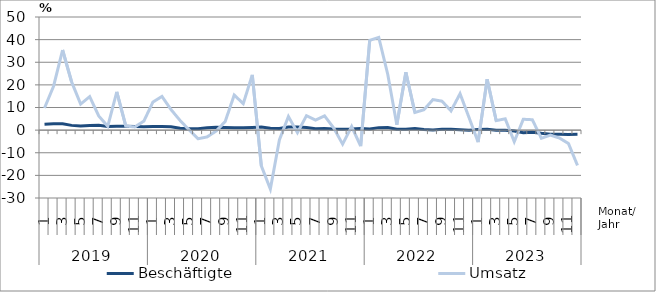
| Category | Beschäftigte | Umsatz |
|---|---|---|
| 0 | 2.6 | 9.8 |
| 1 | 2.8 | 19.4 |
| 2 | 2.8 | 35.4 |
| 3 | 2.1 | 21.3 |
| 4 | 1.8 | 11.5 |
| 5 | 2 | 14.8 |
| 6 | 2.1 | 6.3 |
| 7 | 1.6 | 1.7 |
| 8 | 1.7 | 16.9 |
| 9 | 1.7 | 1.8 |
| 10 | 1.6 | 1.4 |
| 11 | 1.5 | 4 |
| 12 | 1.6 | 12.4 |
| 13 | 1.6 | 14.9 |
| 14 | 1.5 | 9.1 |
| 15 | 0.8 | 4.3 |
| 16 | 0.6 | 0.1 |
| 17 | 0.6 | -3.8 |
| 18 | 1 | -3 |
| 19 | 1.3 | -0.4 |
| 20 | 1.2 | 3.8 |
| 21 | 1 | 15.5 |
| 22 | 1 | 11.7 |
| 23 | 1.2 | 24.4 |
| 24 | 1.4 | -15.8 |
| 25 | 0.8 | -26 |
| 26 | 0.7 | -4.3 |
| 27 | 1.4 | 6 |
| 28 | 1.4 | -1.1 |
| 29 | 1.2 | 6.4 |
| 30 | 0.6 | 4.4 |
| 31 | 0.7 | 6.3 |
| 32 | 0.5 | 1 |
| 33 | 0.4 | -6.2 |
| 34 | 0.5 | 1.6 |
| 35 | 0.7 | -7.1 |
| 36 | 0.5 | 39.7 |
| 37 | 1.1 | 41 |
| 38 | 1.2 | 24.6 |
| 39 | 0.4 | 2.4 |
| 40 | 0.4 | 25.6 |
| 41 | 0.7 | 7.8 |
| 42 | 0.3 | 9 |
| 43 | 0.1 | 13.5 |
| 44 | 0.4 | 12.8 |
| 45 | 0.4 | 8.5 |
| 46 | 0.2 | 16.1 |
| 47 | 0 | 5.5 |
| 48 | 0.3 | -5.3 |
| 49 | 0.4 | 22.5 |
| 50 | -0.1 | 4.2 |
| 51 | -0.1 | 5 |
| 52 | -0.4 | -5.1 |
| 53 | -1.2 | 4.8 |
| 54 | -0.9 | 4.6 |
| 55 | -1.4 | -3.6 |
| 56 | -1.8 | -2.2 |
| 57 | -1.8 | -3.5 |
| 58 | -1.9 | -5.9 |
| 59 | -1.8 | -15.6 |